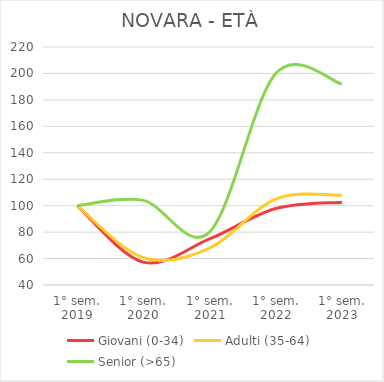
| Category | Giovani (0-34) | Adulti (35-64) | Senior (>65) |
|---|---|---|---|
| 1° sem.
2019 | 100 | 100 | 100 |
| 1° sem.
2020 | 57.292 | 60.611 | 104 |
| 1° sem.
2021 | 74.84 | 67.901 | 80 |
| 1° sem.
2022 | 97.811 | 104.997 | 200 |
| 1° sem.
2023 | 102.661 | 107.995 | 192 |